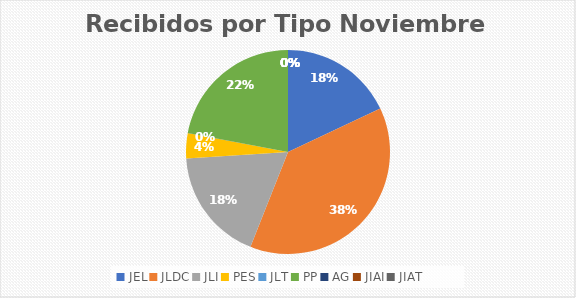
| Category | Series 0 |
|---|---|
| JEL | 9 |
| JLDC | 19 |
| JLI | 9 |
| PES | 2 |
| JLT | 0 |
| PP | 11 |
| AG | 0 |
| JIAI | 0 |
| JIAT | 0 |